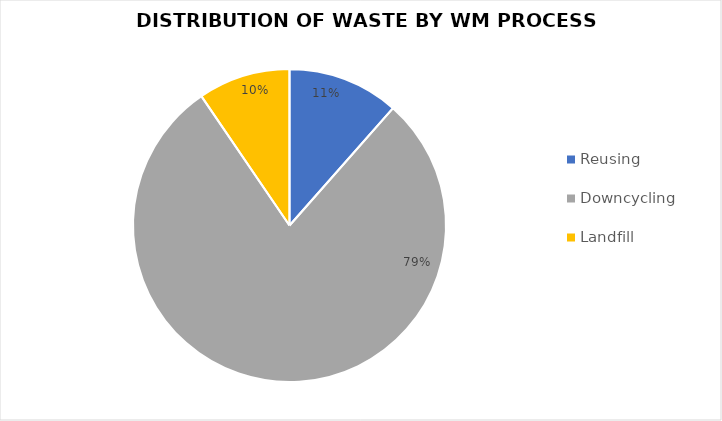
| Category | Series 0 |
|---|---|
| Reusing  | 2306 |
| Downcycling | 15832 |
| Landfill | 1909 |